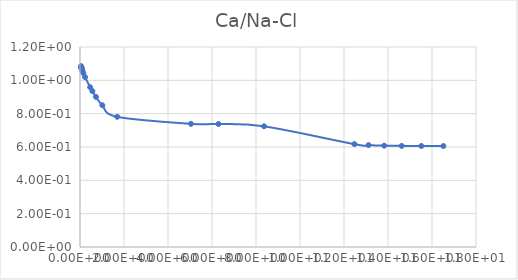
| Category | Series 0 |
|---|---|
| 0.045801 | 1.085 |
| 0.050889 | 1.082 |
| 0.057263 | 1.079 |
| 0.065462 | 1.075 |
| 0.076377 | 1.07 |
| 0.091694 | 1.064 |
| 0.11465 | 1.055 |
| 0.15301 | 1.042 |
| 0.22977 | 1.019 |
| 0.46188 | 0.959 |
| 0.56443 | 0.935 |
| 0.7255 | 0.901 |
| 1.0152 | 0.851 |
| 1.6902 | 0.781 |
| 5.0451 | 0.739 |
| 6.2946 | 0.738 |
| 8.3668 | 0.724 |
| 12.472 | 0.617 |
| 13.115 | 0.611 |
| 13.828 | 0.608 |
| 14.623 | 0.607 |
| 15.513 | 0.606 |
| 16.516 | 0.606 |